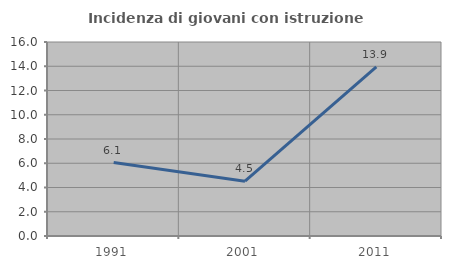
| Category | Incidenza di giovani con istruzione universitaria |
|---|---|
| 1991.0 | 6.061 |
| 2001.0 | 4.52 |
| 2011.0 | 13.944 |